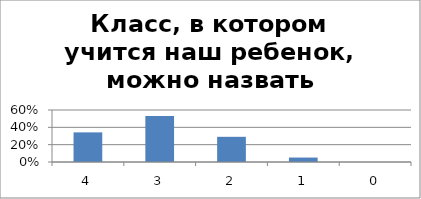
| Category | Класс, в котором учится наш ребенок, можно назвать дружным |
|---|---|
| 4.0 | 0.342 |
| 3.0 | 0.53 |
| 2.0 | 0.291 |
| 1.0 | 0.051 |
| 0.0 | 0 |